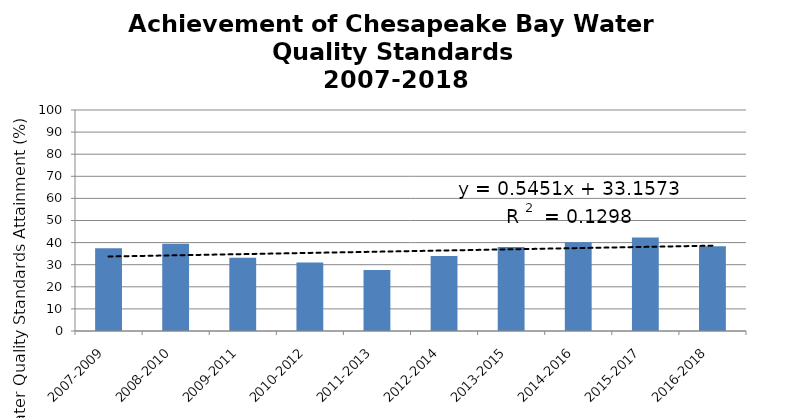
| Category | Area-Weighted |
|---|---|
| 2007-2009 | 37.449 |
| 2008-2010 | 39.51 |
| 2009-2011 | 33.182 |
| 2010-2012 | 30.993 |
| 2011-2013 | 27.61 |
| 2012-2014 | 33.942 |
| 2013-2015 | 38.06 |
| 2014-2016 | 40.165 |
| 2015-2017 | 42.325 |
| 2016-2018 | 38.315 |